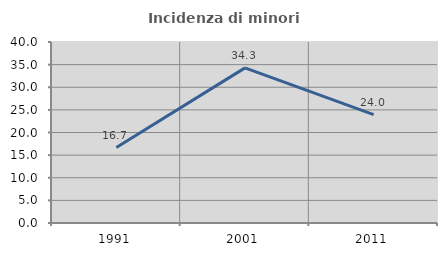
| Category | Incidenza di minori stranieri |
|---|---|
| 1991.0 | 16.667 |
| 2001.0 | 34.286 |
| 2011.0 | 23.963 |